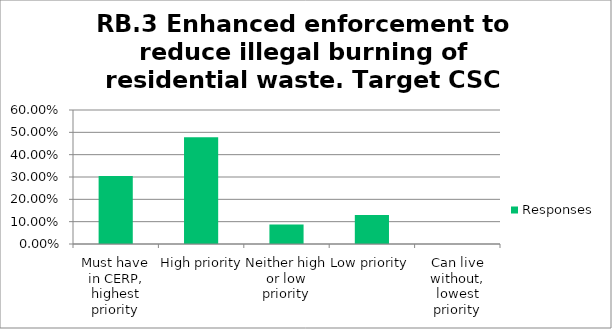
| Category | Responses |
|---|---|
| Must have in CERP, highest priority | 0.304 |
| High priority | 0.478 |
| Neither high or low priority | 0.087 |
| Low priority | 0.13 |
| Can live without, lowest priority | 0 |